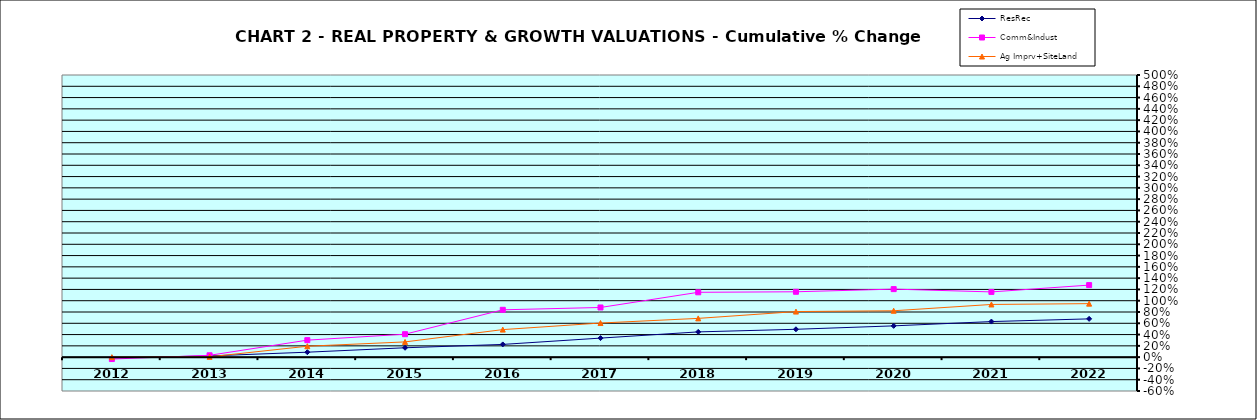
| Category | ResRec | Comm&Indust | Ag Imprv+SiteLand |
|---|---|---|---|
| 2012.0 | -0.013 | -0.033 | 0 |
| 2013.0 | 0.022 | 0.032 | 0.006 |
| 2014.0 | 0.088 | 0.301 | 0.193 |
| 2015.0 | 0.166 | 0.407 | 0.27 |
| 2016.0 | 0.225 | 0.839 | 0.488 |
| 2017.0 | 0.337 | 0.88 | 0.604 |
| 2018.0 | 0.447 | 1.149 | 0.687 |
| 2019.0 | 0.494 | 1.158 | 0.808 |
| 2020.0 | 0.554 | 1.205 | 0.822 |
| 2021.0 | 0.63 | 1.156 | 0.934 |
| 2022.0 | 0.678 | 1.277 | 0.948 |